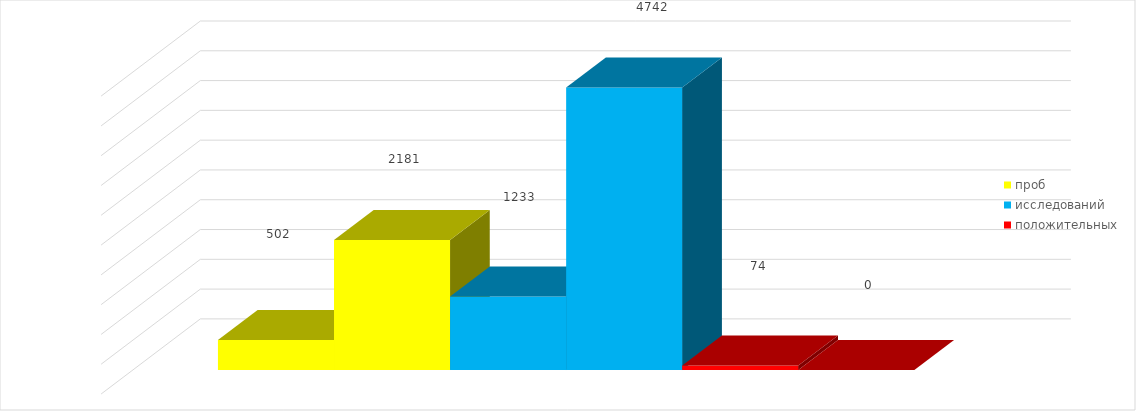
| Category | проб | 1 квартал 2020 год | исследований | положительных |
|---|---|---|---|---|
| 1 квартал 2019 год | 502 | 2181 | 4742 | 0 |